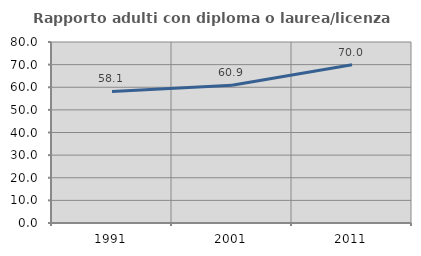
| Category | Rapporto adulti con diploma o laurea/licenza media  |
|---|---|
| 1991.0 | 58.125 |
| 2001.0 | 60.889 |
| 2011.0 | 69.96 |